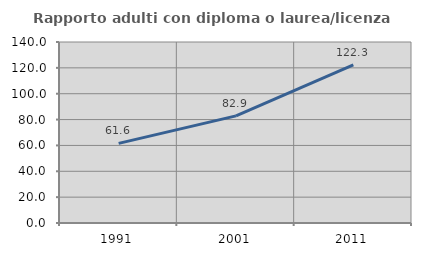
| Category | Rapporto adulti con diploma o laurea/licenza media  |
|---|---|
| 1991.0 | 61.604 |
| 2001.0 | 82.886 |
| 2011.0 | 122.326 |